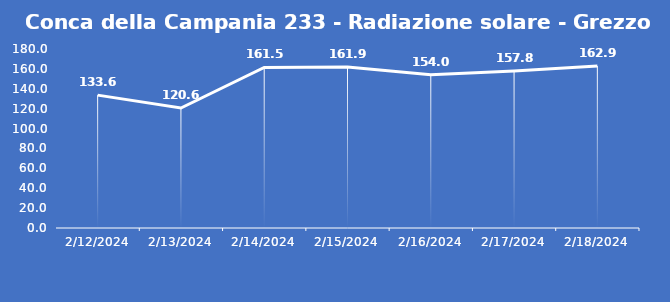
| Category | Conca della Campania 233 - Radiazione solare - Grezzo (W/m2) |
|---|---|
| 2/12/24 | 133.6 |
| 2/13/24 | 120.6 |
| 2/14/24 | 161.5 |
| 2/15/24 | 161.9 |
| 2/16/24 | 154 |
| 2/17/24 | 157.8 |
| 2/18/24 | 162.9 |